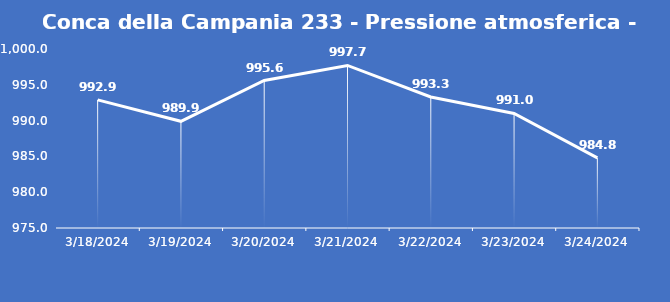
| Category | Conca della Campania 233 - Pressione atmosferica - Grezzo (hPa) |
|---|---|
| 3/18/24 | 992.9 |
| 3/19/24 | 989.9 |
| 3/20/24 | 995.6 |
| 3/21/24 | 997.7 |
| 3/22/24 | 993.3 |
| 3/23/24 | 991 |
| 3/24/24 | 984.8 |